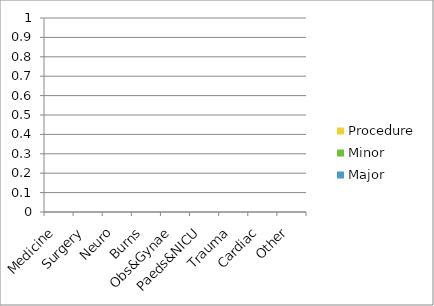
| Category | Major | Minor | Procedure |
|---|---|---|---|
| Medicine | 0 | 0 | 0 |
| Surgery | 0 | 0 | 0 |
| Neuro | 0 | 0 | 0 |
| Burns | 0 | 0 | 0 |
| Obs&Gynae | 0 | 0 | 0 |
| Paeds&NICU | 0 | 0 | 0 |
| Trauma | 0 | 0 | 0 |
| Cardiac | 0 | 0 | 0 |
| Other | 0 | 0 | 0 |